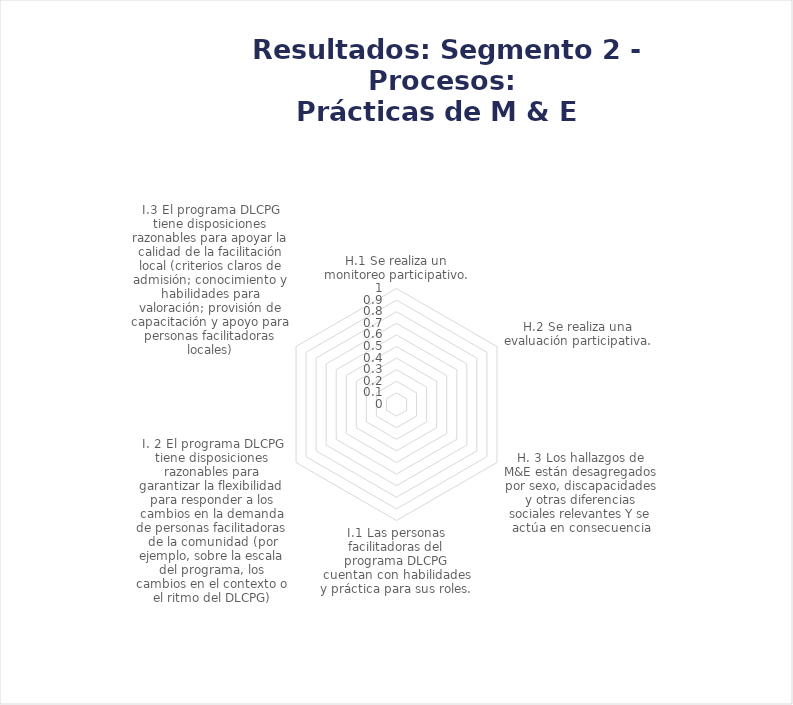
| Category | Resultados: Segmento 2 - Proceso |
|---|---|
| H.1 Se realiza un monitoreo participativo. | 0 |
| H.2 Se realiza una evaluación participativa. | 0 |
| H. 3 Los hallazgos de M&E están desagregados por sexo, discapacidades y otras diferencias sociales relevantes Y se actúa en consecuencia | 0 |
| I.1 Las personas facilitadoras del programa DLCPG cuentan con habilidades y práctica para sus roles. | 0 |
| I. 2 El programa DLCPG tiene disposiciones razonables para garantizar la flexibilidad para responder a los cambios en la demanda de personas facilitadoras de la comunidad (por ejemplo, sobre la escala del programa, los cambios en el contexto o el ritmo del | 0 |
| I.3 El programa DLCPG tiene disposiciones razonables para apoyar la calidad de la facilitación local (criterios claros de admisión; conocimiento y habilidades para valoración; provisión de capacitación y apoyo para personas facilitadoras locales) | 0 |